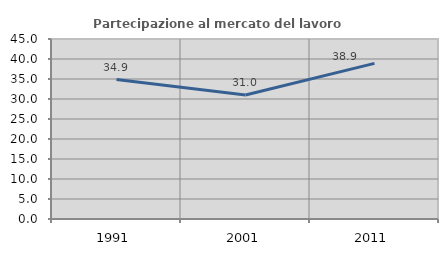
| Category | Partecipazione al mercato del lavoro  femminile |
|---|---|
| 1991.0 | 34.853 |
| 2001.0 | 30.986 |
| 2011.0 | 38.905 |